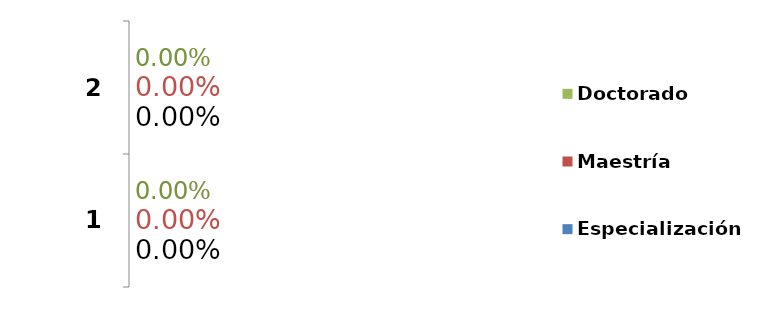
| Category | Especialización | Maestría | Doctorado |
|---|---|---|---|
| 0 | 0 | 0 | 0 |
| 1 | 0 | 0 | 0 |